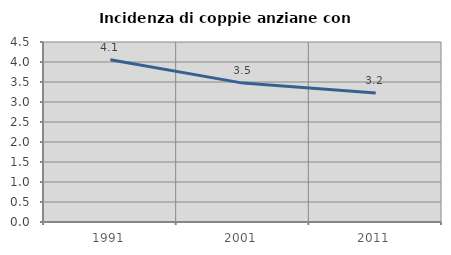
| Category | Incidenza di coppie anziane con figli |
|---|---|
| 1991.0 | 4.054 |
| 2001.0 | 3.472 |
| 2011.0 | 3.226 |